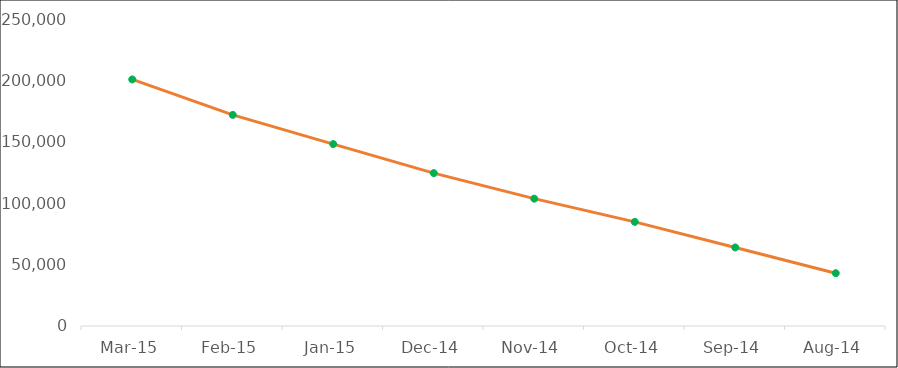
| Category | ACCT CUM BALANCE |
|---|---|
| Mar-15 | 200790 |
| Feb-15 | 171910 |
| Jan-15 | 148130 |
| Dec-14 | 124490 |
| Nov-14 | 103700 |
| Oct-14 | 84800 |
| Sep-14 | 63950 |
| Aug-14 | 43000 |